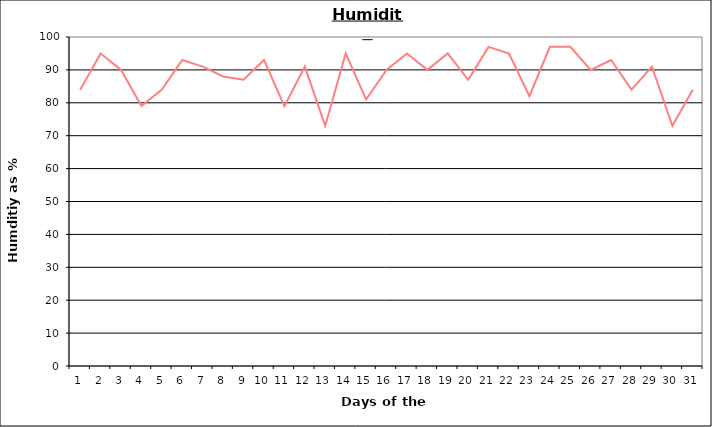
| Category | Series 0 |
|---|---|
| 0 | 84 |
| 1 | 95 |
| 2 | 90 |
| 3 | 79 |
| 4 | 84 |
| 5 | 93 |
| 6 | 91 |
| 7 | 88 |
| 8 | 87 |
| 9 | 93 |
| 10 | 79 |
| 11 | 91 |
| 12 | 73 |
| 13 | 95 |
| 14 | 81 |
| 15 | 90 |
| 16 | 95 |
| 17 | 90 |
| 18 | 95 |
| 19 | 87 |
| 20 | 97 |
| 21 | 95 |
| 22 | 82 |
| 23 | 97 |
| 24 | 97 |
| 25 | 90 |
| 26 | 93 |
| 27 | 84 |
| 28 | 91 |
| 29 | 73 |
| 30 | 84 |